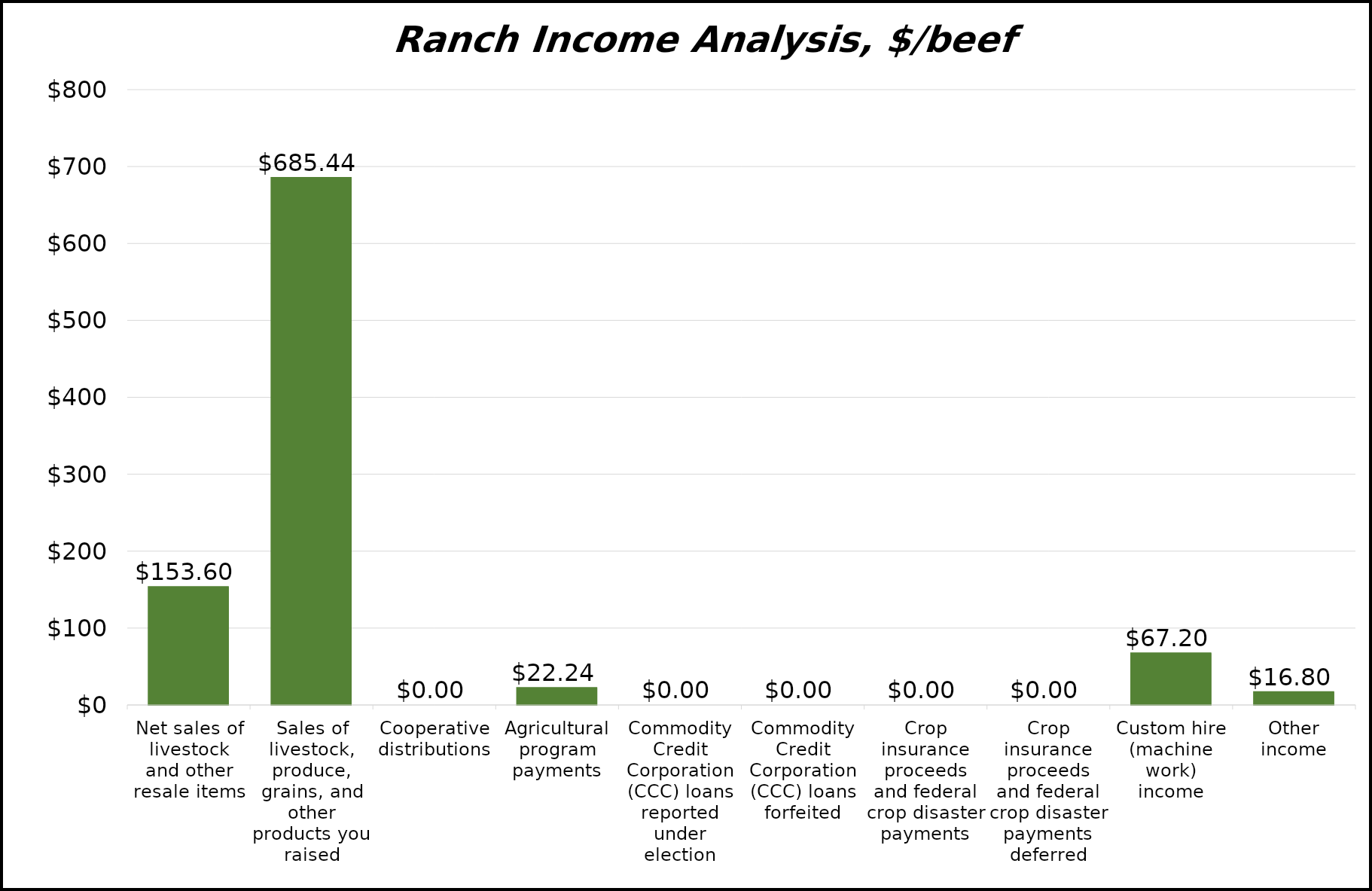
| Category | $/beef cow |
|---|---|
| Net sales of livestock and other resale items | 153.6 |
| Sales of livestock, produce, grains, and other products you raised | 685.44 |
| Cooperative distributions | 0 |
| Agricultural program payments | 22.24 |
| Commodity Credit Corporation (CCC) loans reported under election | 0 |
| Commodity Credit Corporation (CCC) loans forfeited | 0 |
| Crop insurance proceeds and federal crop disaster payments | 0 |
| Crop insurance proceeds and federal crop disaster payments deferred | 0 |
| Custom hire (machine work) income | 67.2 |
| Other income | 16.8 |